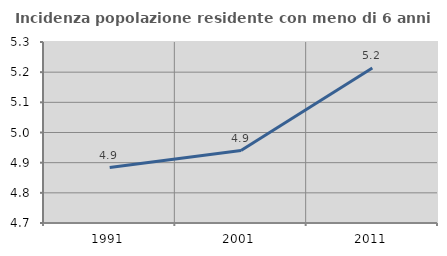
| Category | Incidenza popolazione residente con meno di 6 anni |
|---|---|
| 1991.0 | 4.884 |
| 2001.0 | 4.94 |
| 2011.0 | 5.214 |